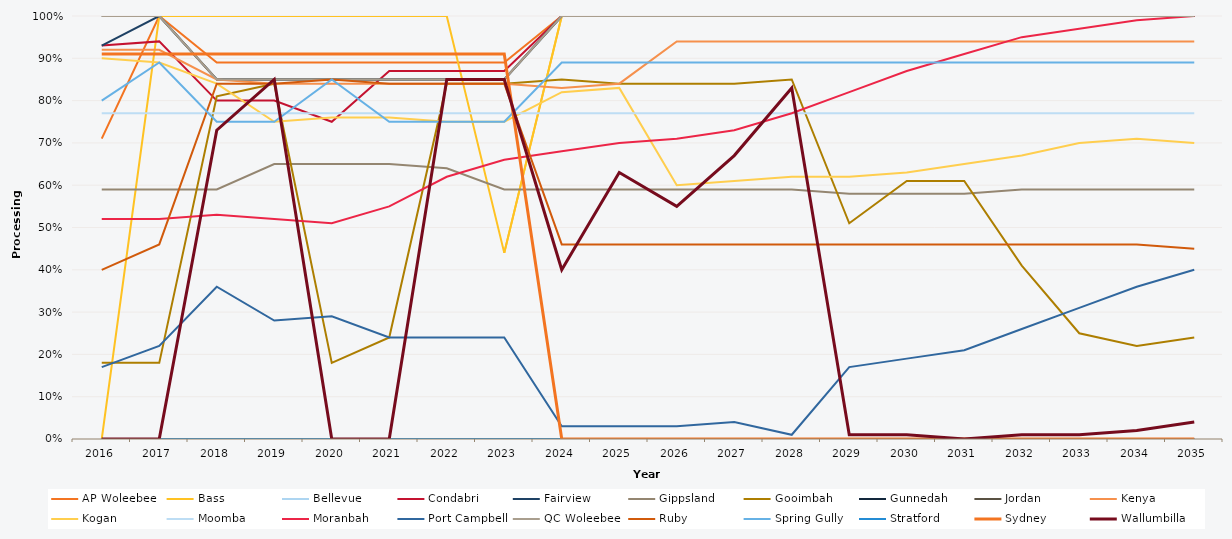
| Category | AP Woleebee | Bass | Bellevue | Condabri | Fairview | Gippsland | Gooimbah | Gunnedah | Jordan | Kenya | Kogan | Moomba | Moranbah | Port Campbell | QC Woleebee | Ruby | Spring Gully | Stratford | Sydney | Wallumbilla |
|---|---|---|---|---|---|---|---|---|---|---|---|---|---|---|---|---|---|---|---|---|
| 2016.0 | 0.71 | 0 | 1 | 0.93 | 0.93 | 0.59 | 0.18 | 0 | 1 | 0.92 | 0.9 | 0.77 | 0.52 | 0.17 | 1 | 0.4 | 0.8 | 0 | 0.91 | 0 |
| 2017.0 | 1 | 1 | 1 | 0.94 | 1 | 0.59 | 0.18 | 0 | 1 | 0.92 | 0.89 | 0.77 | 0.52 | 0.22 | 1 | 0.46 | 0.89 | 0 | 0.91 | 0 |
| 2018.0 | 0.89 | 1 | 0.85 | 0.8 | 0.85 | 0.59 | 0.81 | 0 | 0.85 | 0.85 | 0.84 | 0.77 | 0.53 | 0.36 | 0.85 | 0.84 | 0.75 | 0 | 0.91 | 0.73 |
| 2019.0 | 0.89 | 1 | 0.85 | 0.8 | 0.85 | 0.65 | 0.84 | 0 | 0.85 | 0.84 | 0.75 | 0.77 | 0.52 | 0.28 | 0.85 | 0.84 | 0.75 | 0 | 0.91 | 0.85 |
| 2020.0 | 0.89 | 1 | 0.85 | 0.75 | 0.85 | 0.65 | 0.18 | 0 | 0.85 | 0.84 | 0.76 | 0.77 | 0.51 | 0.29 | 0.85 | 0.85 | 0.85 | 0 | 0.91 | 0 |
| 2021.0 | 0.89 | 1 | 0.85 | 0.87 | 0.85 | 0.65 | 0.24 | 0 | 0.85 | 0.84 | 0.76 | 0.77 | 0.55 | 0.24 | 0.85 | 0.84 | 0.75 | 0 | 0.91 | 0 |
| 2022.0 | 0.89 | 1 | 0.85 | 0.87 | 0.85 | 0.64 | 0.84 | 0 | 0.85 | 0.84 | 0.75 | 0.77 | 0.62 | 0.24 | 0.85 | 0.84 | 0.75 | 0 | 0.91 | 0.85 |
| 2023.0 | 0.89 | 0.44 | 0.85 | 0.87 | 0.85 | 0.59 | 0.84 | 0 | 0.85 | 0.84 | 0.75 | 0.77 | 0.66 | 0.24 | 0.85 | 0.84 | 0.75 | 0 | 0.91 | 0.85 |
| 2024.0 | 1 | 1 | 1 | 1 | 1 | 0.59 | 0.85 | 0 | 1 | 0.83 | 0.82 | 0.77 | 0.68 | 0.03 | 1 | 0.46 | 0.89 | 0 | 0 | 0.4 |
| 2025.0 | 1 | 1 | 1 | 1 | 1 | 0.59 | 0.84 | 0 | 1 | 0.84 | 0.83 | 0.77 | 0.7 | 0.03 | 1 | 0.46 | 0.89 | 0 | 0 | 0.63 |
| 2026.0 | 1 | 1 | 1 | 1 | 1 | 0.59 | 0.84 | 0 | 1 | 0.94 | 0.6 | 0.77 | 0.71 | 0.03 | 1 | 0.46 | 0.89 | 0 | 0 | 0.55 |
| 2027.0 | 1 | 1 | 1 | 1 | 1 | 0.59 | 0.84 | 0 | 1 | 0.94 | 0.61 | 0.77 | 0.73 | 0.04 | 1 | 0.46 | 0.89 | 0 | 0 | 0.67 |
| 2028.0 | 1 | 1 | 1 | 1 | 1 | 0.59 | 0.85 | 0 | 1 | 0.94 | 0.62 | 0.77 | 0.77 | 0.01 | 1 | 0.46 | 0.89 | 0 | 0 | 0.83 |
| 2029.0 | 1 | 1 | 1 | 1 | 1 | 0.58 | 0.51 | 0 | 1 | 0.94 | 0.62 | 0.77 | 0.82 | 0.17 | 1 | 0.46 | 0.89 | 0 | 0 | 0.01 |
| 2030.0 | 1 | 1 | 1 | 1 | 1 | 0.58 | 0.61 | 0 | 1 | 0.94 | 0.63 | 0.77 | 0.87 | 0.19 | 1 | 0.46 | 0.89 | 0 | 0 | 0.01 |
| 2031.0 | 1 | 1 | 1 | 1 | 1 | 0.58 | 0.61 | 0 | 1 | 0.94 | 0.65 | 0.77 | 0.91 | 0.21 | 1 | 0.46 | 0.89 | 0 | 0 | 0 |
| 2032.0 | 1 | 1 | 1 | 1 | 1 | 0.59 | 0.41 | 0 | 1 | 0.94 | 0.67 | 0.77 | 0.95 | 0.26 | 1 | 0.46 | 0.89 | 0 | 0 | 0.01 |
| 2033.0 | 1 | 1 | 1 | 1 | 1 | 0.59 | 0.25 | 0 | 1 | 0.94 | 0.7 | 0.77 | 0.97 | 0.31 | 1 | 0.46 | 0.89 | 0 | 0 | 0.01 |
| 2034.0 | 1 | 1 | 1 | 1 | 1 | 0.59 | 0.22 | 0 | 1 | 0.94 | 0.71 | 0.77 | 0.99 | 0.36 | 1 | 0.46 | 0.89 | 0 | 0 | 0.02 |
| 2035.0 | 1 | 1 | 1 | 1 | 1 | 0.59 | 0.24 | 0 | 1 | 0.94 | 0.7 | 0.77 | 1 | 0.4 | 1 | 0.45 | 0.89 | 0 | 0 | 0.04 |